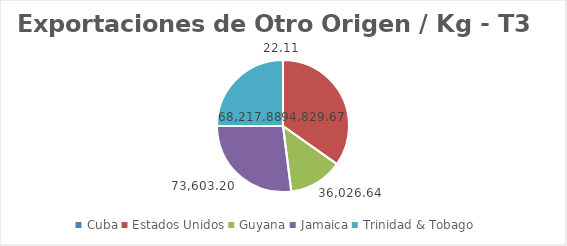
| Category | kg |
|---|---|
| Cuba | 22.11 |
| Estados Unidos | 94829.67 |
| Guyana | 36026.64 |
| Jamaica | 73603.2 |
| Trinidad & Tobago | 68217.88 |